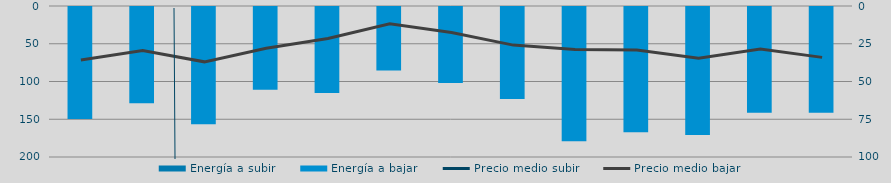
| Category | Energía a subir | Energía a bajar |
|---|---|---|
| D |  | 149.517 |
| E |  | 128.775 |
| F |  | 156.615 |
| M |  | 110.92 |
| A |  | 115.196 |
| M |  | 85.375 |
| J |  | 101.923 |
| J |  | 123.137 |
| A |  | 178.975 |
| S |  | 167.321 |
| O |  | 170.789 |
| N |  | 141.32 |
| D |  | 141.434 |